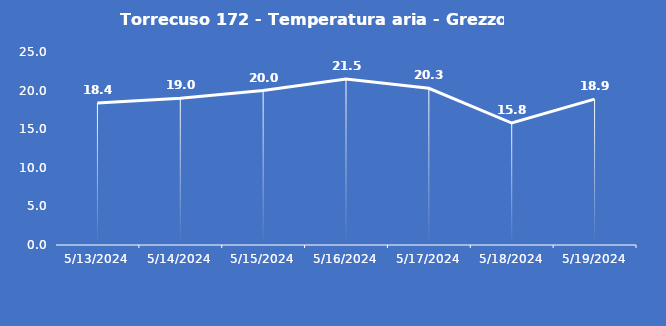
| Category | Torrecuso 172 - Temperatura aria - Grezzo (°C) |
|---|---|
| 5/13/24 | 18.4 |
| 5/14/24 | 19 |
| 5/15/24 | 20 |
| 5/16/24 | 21.5 |
| 5/17/24 | 20.3 |
| 5/18/24 | 15.8 |
| 5/19/24 | 18.9 |